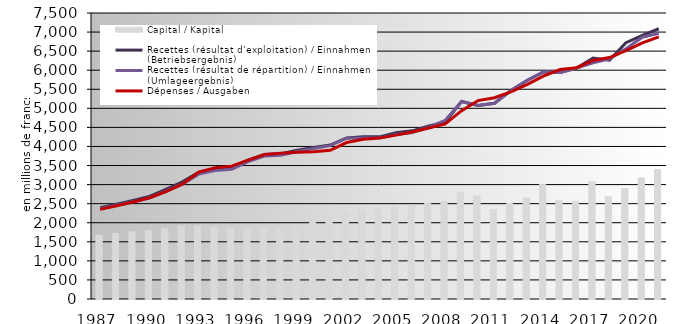
| Category | Capital / Kapital |
|---|---|
| 1987.0 | 1675.338 |
| 1988.0 | 1719.399 |
| 1989.0 | 1760.966 |
| 1990.0 | 1795.03 |
| 1991.0 | 1855.336 |
| 1992.0 | 1915.53 |
| 1993.0 | 1915.239 |
| 1994.0 | 1886.788 |
| 1995.0 | 1847.016 |
| 1996.0 | 1845.612 |
| 1997.0 | 1847.398 |
| 1998.0 | 1837.162 |
| 1999.0 | 1892.885 |
| 2000.0 | 2005.735 |
| 2001.0 | 2142.216 |
| 2002.0 | 2262.405 |
| 2003.0 | 2331.189 |
| 2004.0 | 2363.923 |
| 2005.0 | 2427.671 |
| 2006.0 | 2457.099 |
| 2007.0 | 2511.969 |
| 2008.0 | 2558.914 |
| 2009.0 | 2800 |
| 2010.0 | 2700 |
| 2011.0 | 2344.766 |
| 2012.0 | 2504.797 |
| 2013.0 | 2647.291 |
| 2014.0 | 3008.188 |
| 2015.0 | 2579.621 |
| 2016.0 | 2563.224 |
| 2017.0 | 3074.773 |
| 2018.0 | 2678.79 |
| 2019.0 | 2895.411 |
| 2020.0 | 3176.273 |
| 2021.0 | 3395.108 |